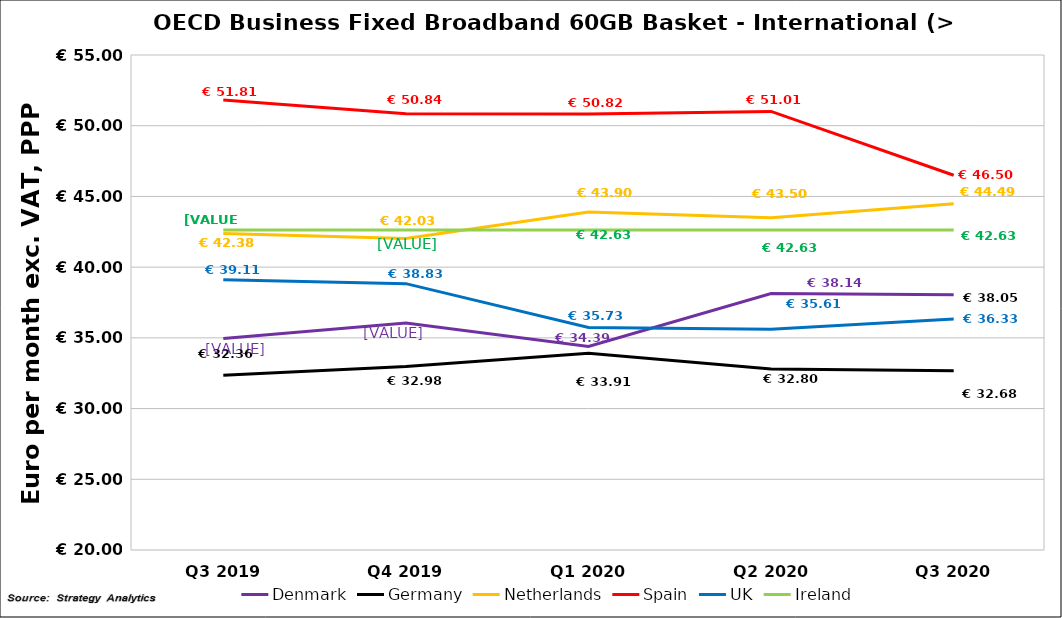
| Category | Denmark | Germany | Netherlands | Spain | UK | Ireland |
|---|---|---|---|---|---|---|
| Q3 2019 | 34.96 | 32.356 | 42.38 | 51.81 | 39.114 | 42.631 |
| Q4 2019 | 36.056 | 32.983 | 42.033 | 50.843 | 38.833 | 42.631 |
| Q1 2020 | 34.392 | 33.908 | 43.905 | 50.824 | 35.733 | 42.631 |
| Q2 2020 | 38.14 | 32.8 | 43.5 | 51.01 | 35.61 | 42.63 |
| Q3 2020 | 38.048 | 32.681 | 44.488 | 46.496 | 36.333 | 42.631 |